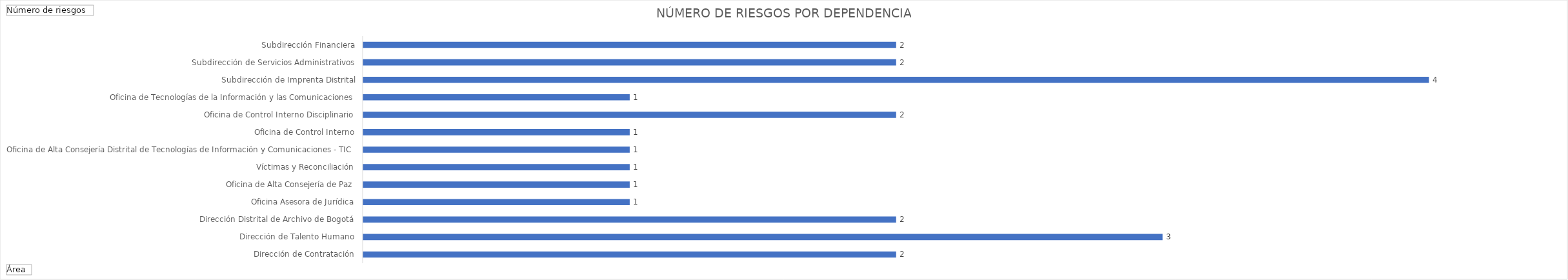
| Category | Total |
|---|---|
| Dirección de Contratación | 2 |
| Dirección de Talento Humano | 3 |
| Dirección Distrital de Archivo de Bogotá | 2 |
| Oficina Asesora de Jurídica | 1 |
| Oficina de Alta Consejería de Paz, Víctimas y Reconciliación | 1 |
| Oficina de Alta Consejería Distrital de Tecnologías de Información y Comunicaciones - TIC | 1 |
| Oficina de Control Interno | 1 |
| Oficina de Control Interno Disciplinario | 1 |
| Oficina de Tecnologías de la Información y las Comunicaciones | 2 |
| Subdirección de Imprenta Distrital | 1 |
| Subdirección de Servicios Administrativos | 4 |
| Subdirección Financiera | 2 |
| Subsecretaría de Servicio a la Ciudadanía | 2 |